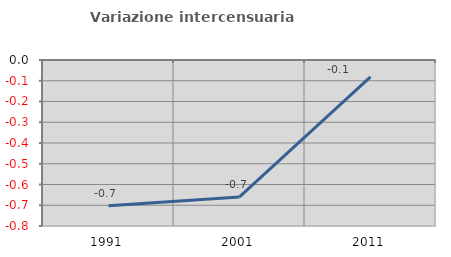
| Category | Variazione intercensuaria annua |
|---|---|
| 1991.0 | -0.703 |
| 2001.0 | -0.66 |
| 2011.0 | -0.081 |